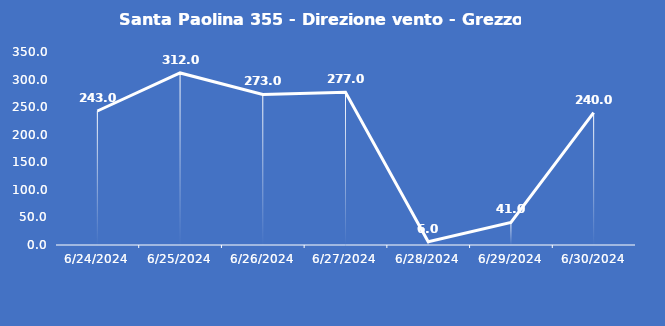
| Category | Santa Paolina 355 - Direzione vento - Grezzo (°N) |
|---|---|
| 6/24/24 | 243 |
| 6/25/24 | 312 |
| 6/26/24 | 273 |
| 6/27/24 | 277 |
| 6/28/24 | 6 |
| 6/29/24 | 41 |
| 6/30/24 | 240 |